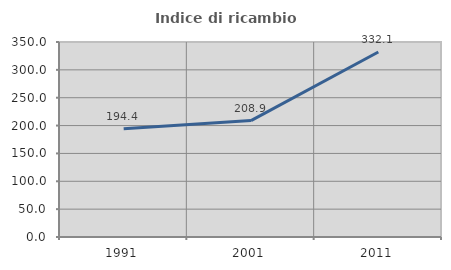
| Category | Indice di ricambio occupazionale  |
|---|---|
| 1991.0 | 194.444 |
| 2001.0 | 208.911 |
| 2011.0 | 332.099 |